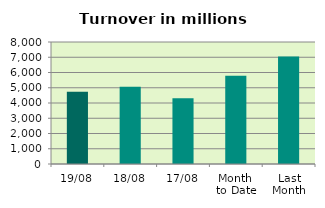
| Category | Series 0 |
|---|---|
| 19/08 | 4736.714 |
| 18/08 | 5059.484 |
| 17/08 | 4314.248 |
| Month 
to Date | 5794.674 |
| Last
Month | 7041.386 |